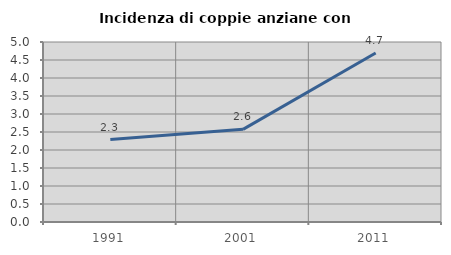
| Category | Incidenza di coppie anziane con figli |
|---|---|
| 1991.0 | 2.29 |
| 2001.0 | 2.574 |
| 2011.0 | 4.693 |